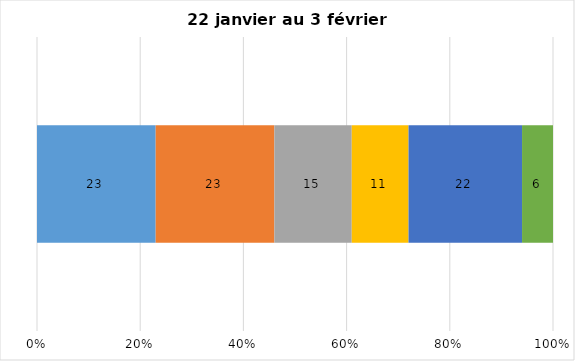
| Category | Plusieurs fois par jour | Une fois par jour | Quelques fois par semaine   | Une fois par semaine ou moins   |  Jamais   |  Je n’utilise pas les médias sociaux |
|---|---|---|---|---|---|---|
| 0 | 23 | 23 | 15 | 11 | 22 | 6 |